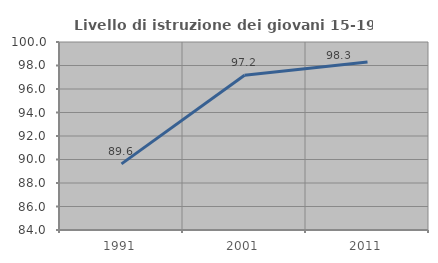
| Category | Livello di istruzione dei giovani 15-19 anni |
|---|---|
| 1991.0 | 89.63 |
| 2001.0 | 97.17 |
| 2011.0 | 98.291 |